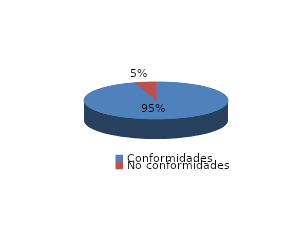
| Category | Series 0 |
|---|---|
| Conformidades | 1413 |
| No conformidades | 70 |